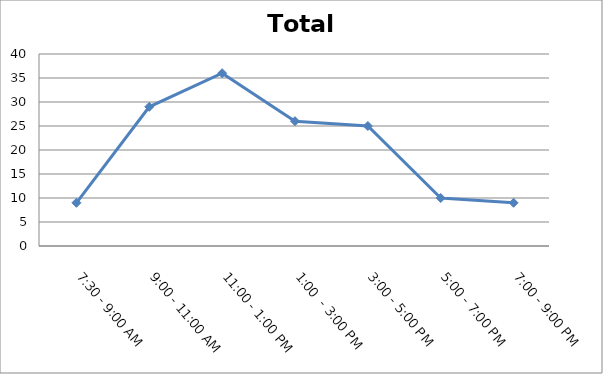
| Category | Total |
|---|---|
| 7:30 - 9:00 AM | 9 |
| 9:00 - 11:00 AM | 29 |
| 11:00 - 1:00 PM | 36 |
| 1:00  - 3:00 PM | 26 |
| 3:00 - 5:00 PM | 25 |
| 5:00 - 7:00 PM | 10 |
| 7:00 - 9:00 PM | 9 |